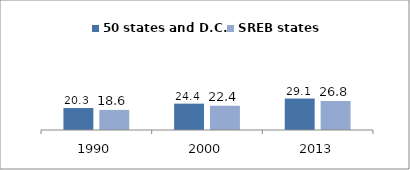
| Category | 50 states and D.C. | SREB states |
|---|---|---|
| 1990.0 | 20.338 | 18.619 |
| 2000.0 | 24.402 | 22.445 |
| 2013.0 | 29.112 | 26.84 |